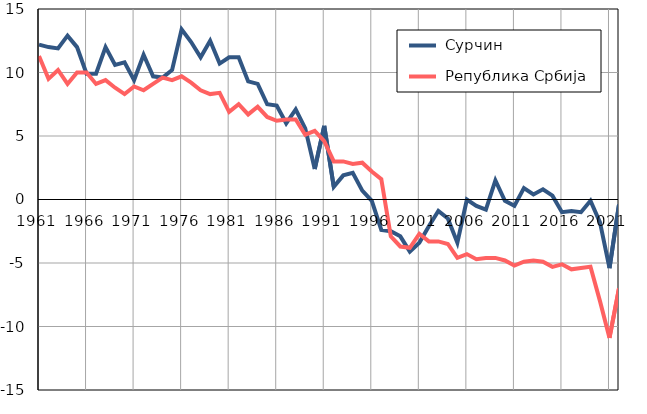
| Category |  Сурчин |  Република Србија |
|---|---|---|
| 1961.0 | 12.2 | 11.3 |
| 1962.0 | 12 | 9.5 |
| 1963.0 | 11.9 | 10.2 |
| 1964.0 | 12.9 | 9.1 |
| 1965.0 | 12 | 10 |
| 1966.0 | 9.9 | 10 |
| 1967.0 | 9.9 | 9.1 |
| 1968.0 | 12 | 9.4 |
| 1969.0 | 10.6 | 8.8 |
| 1970.0 | 10.8 | 8.3 |
| 1971.0 | 9.4 | 8.9 |
| 1972.0 | 11.4 | 8.6 |
| 1973.0 | 9.7 | 9.1 |
| 1974.0 | 9.6 | 9.6 |
| 1975.0 | 10.2 | 9.4 |
| 1976.0 | 13.4 | 9.7 |
| 1977.0 | 12.4 | 9.2 |
| 1978.0 | 11.2 | 8.6 |
| 1979.0 | 12.5 | 8.3 |
| 1980.0 | 10.7 | 8.4 |
| 1981.0 | 11.2 | 6.9 |
| 1982.0 | 11.2 | 7.5 |
| 1983.0 | 9.3 | 6.7 |
| 1984.0 | 9.1 | 7.3 |
| 1985.0 | 7.5 | 6.5 |
| 1986.0 | 7.4 | 6.2 |
| 1987.0 | 6 | 6.3 |
| 1988.0 | 7.1 | 6.3 |
| 1989.0 | 5.6 | 5.1 |
| 1990.0 | 2.4 | 5.4 |
| 1991.0 | 5.8 | 4.6 |
| 1992.0 | 1 | 3 |
| 1993.0 | 1.9 | 3 |
| 1994.0 | 2.1 | 2.8 |
| 1995.0 | 0.7 | 2.9 |
| 1996.0 | -0.1 | 2.2 |
| 1997.0 | -2.4 | 1.6 |
| 1998.0 | -2.5 | -2.9 |
| 1999.0 | -2.9 | -3.7 |
| 2000.0 | -4.1 | -3.8 |
| 2001.0 | -3.4 | -2.7 |
| 2002.0 | -2.1 | -3.3 |
| 2003.0 | -0.9 | -3.3 |
| 2004.0 | -1.5 | -3.5 |
| 2005.0 | -3.4 | -4.6 |
| 2006.0 | 0 | -4.3 |
| 2007.0 | -0.5 | -4.7 |
| 2008.0 | -0.8 | -4.6 |
| 2009.0 | 1.5 | -4.6 |
| 2010.0 | -0.1 | -4.8 |
| 2011.0 | -0.5 | -5.2 |
| 2012.0 | 0.9 | -4.9 |
| 2013.0 | 0.4 | -4.8 |
| 2014.0 | 0.8 | -4.9 |
| 2015.0 | 0.3 | -5.3 |
| 2016.0 | -1 | -5.1 |
| 2017.0 | -0.9 | -5.5 |
| 2018.0 | -1 | -5.4 |
| 2019.0 | -0.1 | -5.3 |
| 2020.0 | -1.8 | -8 |
| 2021.0 | -5.4 | -10.9 |
| 2022.0 | -0.4 | -7 |